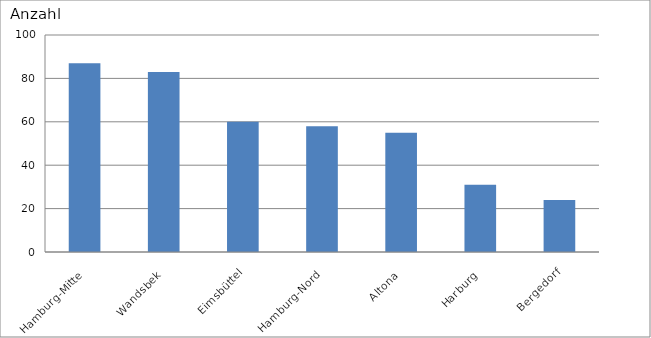
| Category | Hamburg-Mitte |
|---|---|
| Hamburg-Mitte | 87 |
| Wandsbek | 83 |
| Eimsbüttel | 60 |
| Hamburg-Nord | 58 |
| Altona | 55 |
| Harburg | 31 |
| Bergedorf | 24 |